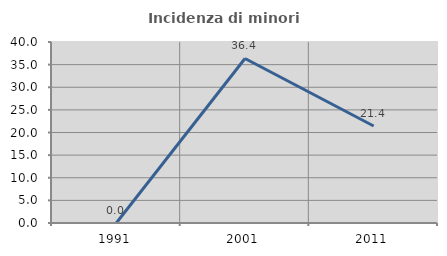
| Category | Incidenza di minori stranieri |
|---|---|
| 1991.0 | 0 |
| 2001.0 | 36.364 |
| 2011.0 | 21.429 |